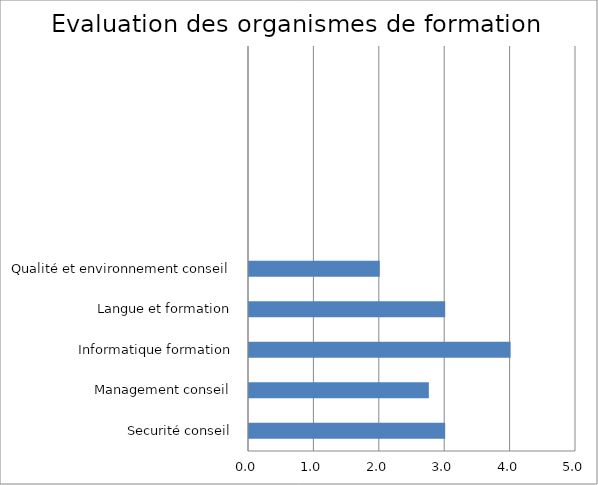
| Category | Series 0 |
|---|---|
| Securité conseil | 3 |
| Management conseil | 2.75 |
| Informatique formation | 4 |
| Langue et formation | 3 |
| Qualité et environnement conseil | 2 |